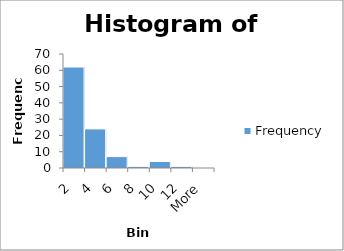
| Category | Frequency |
|---|---|
| 2 | 62 |
| 4 | 24 |
| 6 | 7 |
| 8 | 1 |
| 10 | 4 |
| 12 | 1 |
| More | 0 |